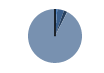
| Category | Series 0 |
|---|---|
| ARRASTRE | 12 |
| CERCO | 35 |
| PALANGRE | 18 |
| REDES DE ENMALLE | 0 |
| ARTES FIJAS | 1 |
| ARTES MENORES | 805 |
| SIN TIPO ASIGNADO | 0 |